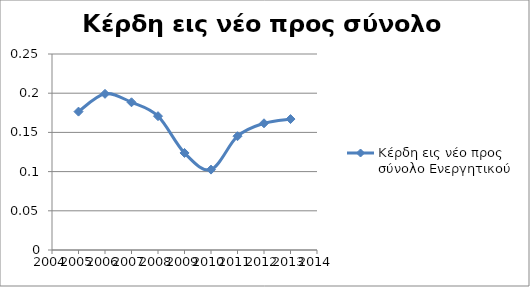
| Category | Κέρδη εις νέο προς σύνολο Ενεργητικού |
|---|---|
| 2005.0 | 0.177 |
| 2006.0 | 0.199 |
| 2007.0 | 0.188 |
| 2008.0 | 0.171 |
| 2009.0 | 0.124 |
| 2010.0 | 0.103 |
| 2011.0 | 0.145 |
| 2012.0 | 0.162 |
| 2013.0 | 0.167 |